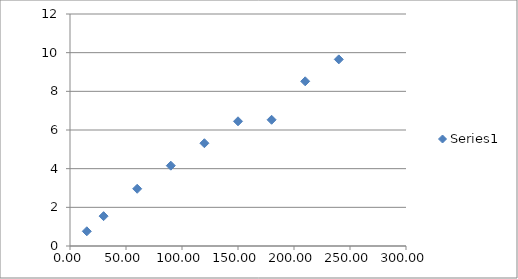
| Category | Series 0 |
|---|---|
| 15.0 | 0.761 |
| 30.0 | 1.544 |
| 60.0 | 2.96 |
| 90.0 | 4.155 |
| 120.0 | 5.316 |
| 150.0 | 6.45 |
| 180.0 | 6.529 |
| 210.0 | 8.519 |
| 240.0 | 9.653 |